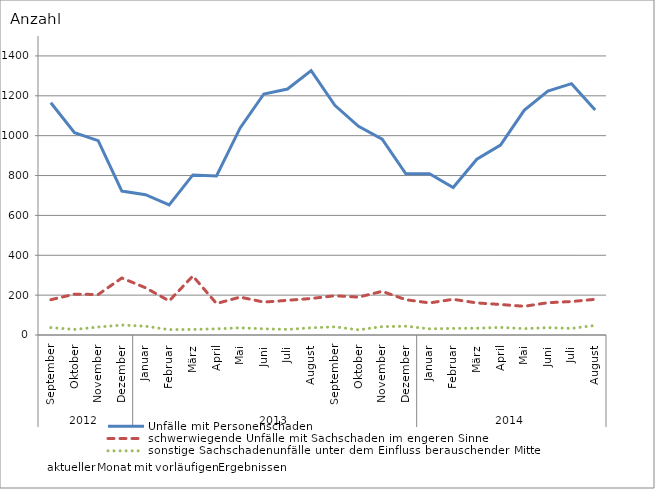
| Category | Unfälle mit Personenschaden | schwerwiegende Unfälle mit Sachschaden im engeren Sinne | sonstige Sachschadenunfälle unter dem Einfluss berauschender Mittel |
|---|---|---|---|
| 0 | 1165 | 177 | 37 |
| 1 | 1015 | 205 | 28 |
| 2 | 975 | 203 | 40 |
| 3 | 722 | 286 | 50 |
| 4 | 704 | 237 | 44 |
| 5 | 653 | 171 | 27 |
| 6 | 803 | 296 | 28 |
| 7 | 798 | 158 | 31 |
| 8 | 1039 | 190 | 36 |
| 9 | 1209 | 165 | 31 |
| 10 | 1234 | 174 | 28 |
| 11 | 1326 | 183 | 36 |
| 12 | 1152 | 197 | 41 |
| 13 | 1047 | 190 | 26 |
| 14 | 983 | 219 | 42 |
| 15 | 809 | 177 | 44 |
| 16 | 809 | 161 | 31 |
| 17 | 740 | 179 | 33 |
| 18 | 882 | 161 | 34 |
| 19 | 953 | 153 | 38 |
| 20 | 1127 | 144 | 32 |
| 21 | 1224 | 162 | 37 |
| 22 | 1261 | 168 | 33 |
| 23 | 1129 | 179 | 48 |